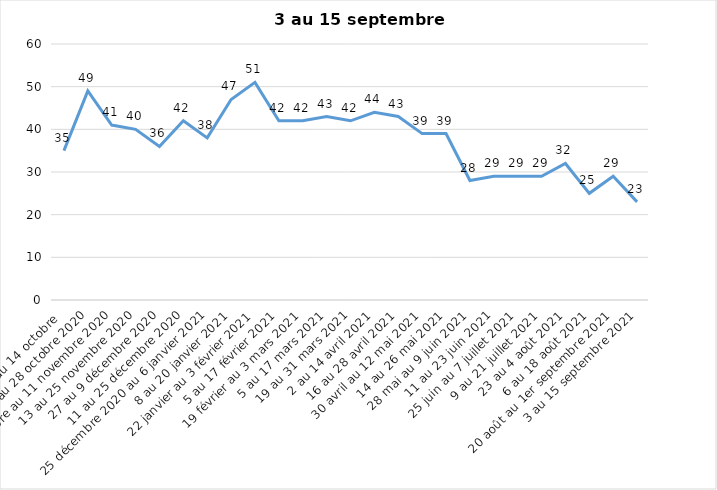
| Category | Toujours aux trois mesures |
|---|---|
| 2 au 14 octobre  | 35 |
| 16 au 28 octobre 2020 | 49 |
| 30 octobre au 11 novembre 2020 | 41 |
| 13 au 25 novembre 2020 | 40 |
| 27 au 9 décembre 2020 | 36 |
| 11 au 25 décembre 2020 | 42 |
| 25 décembre 2020 au 6 janvier 2021 | 38 |
| 8 au 20 janvier 2021 | 47 |
| 22 janvier au 3 février 2021 | 51 |
| 5 au 17 février 2021 | 42 |
| 19 février au 3 mars 2021 | 42 |
| 5 au 17 mars 2021 | 43 |
| 19 au 31 mars 2021 | 42 |
| 2 au 14 avril 2021 | 44 |
| 16 au 28 avril 2021 | 43 |
| 30 avril au 12 mai 2021 | 39 |
| 14 au 26 mai 2021 | 39 |
| 28 mai au 9 juin 2021 | 28 |
| 11 au 23 juin 2021 | 29 |
| 25 juin au 7 juillet 2021 | 29 |
| 9 au 21 juillet 2021 | 29 |
| 23 au 4 août 2021 | 32 |
| 6 au 18 août 2021 | 25 |
| 20 août au 1er septembre 2021 | 29 |
| 3 au 15 septembre 2021 | 23 |